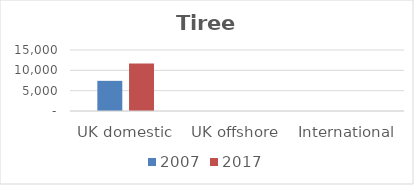
| Category | 2007 | 2017 |
|---|---|---|
| UK domestic | 7417 | 11695 |
| UK offshore | 0 | 0 |
| International | 0 | 0 |